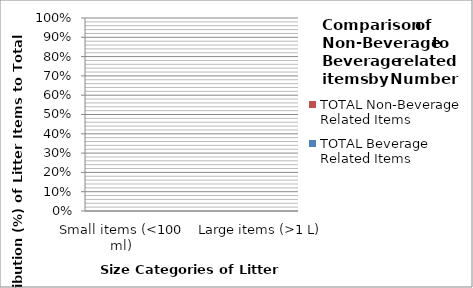
| Category | TOTAL Beverage Related Items | TOTAL Non-Beverage Related Items |
|---|---|---|
| Small items (<100 ml) | 0 | 0 |
| Medium items             (100 ml - 1 L) | 0 | 0 |
| Large items (>1 L) | 0 | 0 |